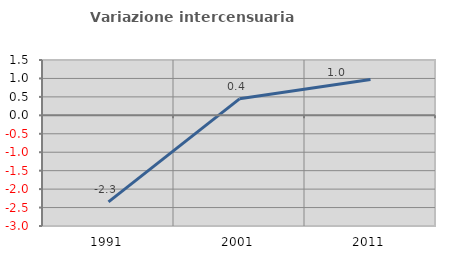
| Category | Variazione intercensuaria annua |
|---|---|
| 1991.0 | -2.345 |
| 2001.0 | 0.447 |
| 2011.0 | 0.974 |